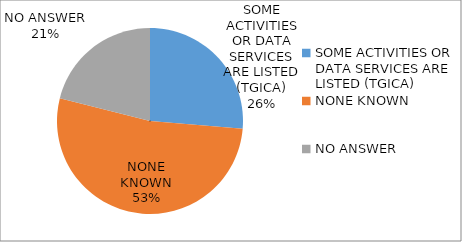
| Category | Series 0 |
|---|---|
| SOME ACTIVITIES OR DATA SERVICES ARE LISTED (TGICA) | 0.263 |
| NONE KNOWN | 0.526 |
| NO ANSWER | 0.211 |